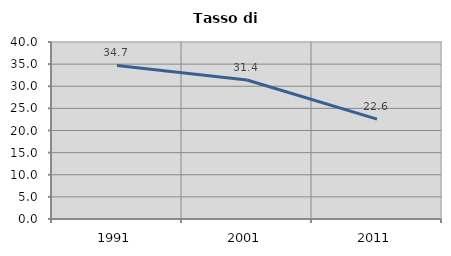
| Category | Tasso di disoccupazione   |
|---|---|
| 1991.0 | 34.702 |
| 2001.0 | 31.403 |
| 2011.0 | 22.565 |